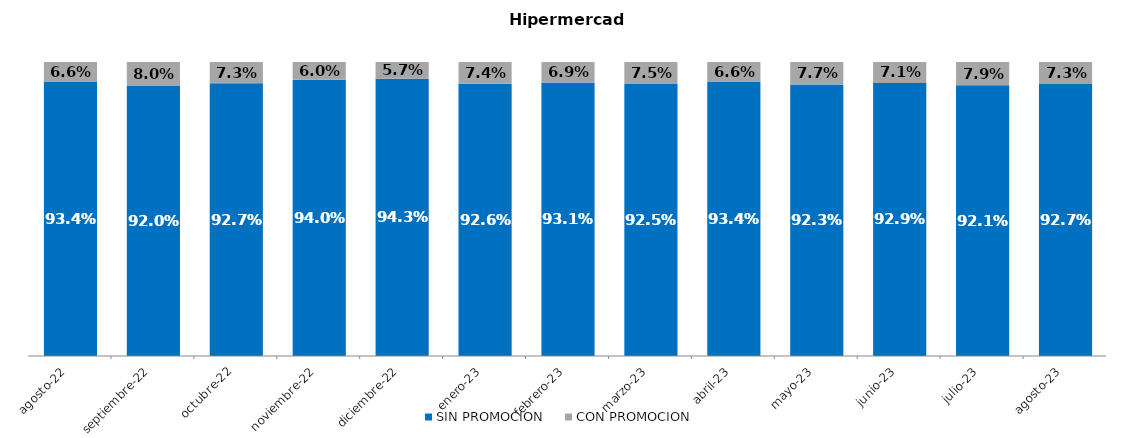
| Category | SIN PROMOCION   | CON PROMOCION   |
|---|---|---|
| 2022-08-01 | 0.934 | 0.066 |
| 2022-09-01 | 0.92 | 0.08 |
| 2022-10-01 | 0.927 | 0.073 |
| 2022-11-01 | 0.94 | 0.06 |
| 2022-12-01 | 0.943 | 0.057 |
| 2023-01-01 | 0.926 | 0.074 |
| 2023-02-01 | 0.931 | 0.069 |
| 2023-03-01 | 0.925 | 0.075 |
| 2023-04-01 | 0.934 | 0.066 |
| 2023-05-01 | 0.923 | 0.077 |
| 2023-06-01 | 0.929 | 0.071 |
| 2023-07-01 | 0.921 | 0.079 |
| 2023-08-01 | 0.927 | 0.073 |